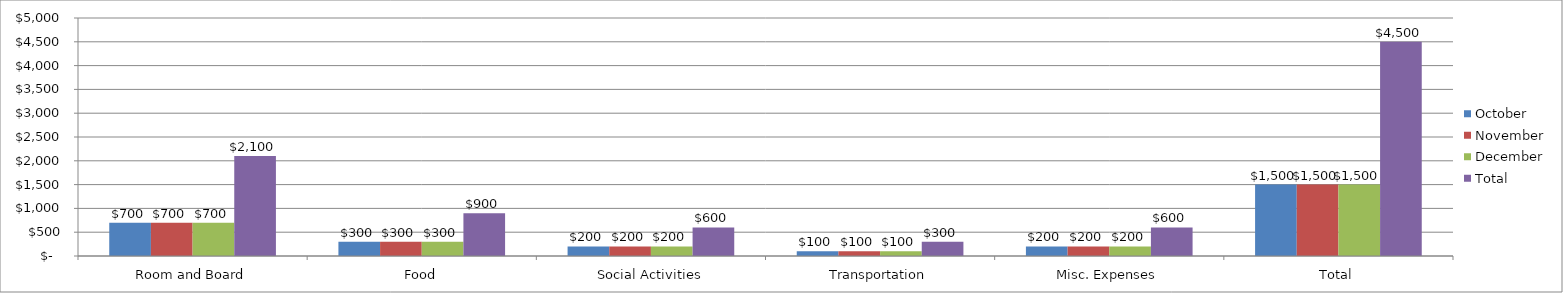
| Category | October | November | December | Total |
|---|---|---|---|---|
| Room and Board | 700 | 700 | 700 | 2100 |
| Food | 300 | 300 | 300 | 900 |
| Social Activities | 200 | 200 | 200 | 600 |
| Transportation | 100 | 100 | 100 | 300 |
| Misc. Expenses | 200 | 200 | 200 | 600 |
| Total | 1500 | 1500 | 1500 | 4500 |